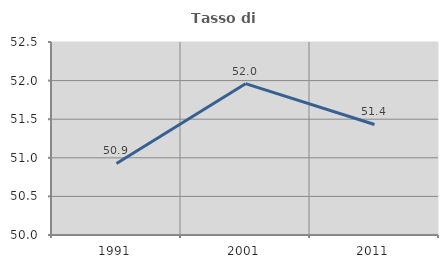
| Category | Tasso di occupazione   |
|---|---|
| 1991.0 | 50.927 |
| 2001.0 | 51.96 |
| 2011.0 | 51.432 |